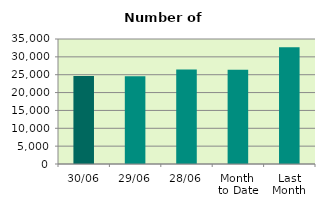
| Category | Series 0 |
|---|---|
| 30/06 | 24642 |
| 29/06 | 24568 |
| 28/06 | 26442 |
| Month 
to Date | 26399.455 |
| Last
Month | 32723.818 |